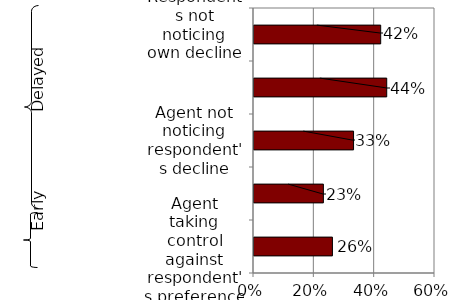
| Category | Series 0 |
|---|---|
| Agent taking control against respondent's preference | 0.26 |
| Agent not being available | 0.23 |
| Agent not noticing respondent's decline | 0.33 |
| Respondents not wanting to give up the control | 0.44 |
| Respondents not noticing own decline | 0.42 |